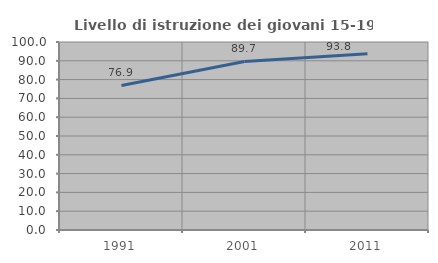
| Category | Livello di istruzione dei giovani 15-19 anni |
|---|---|
| 1991.0 | 76.898 |
| 2001.0 | 89.677 |
| 2011.0 | 93.75 |